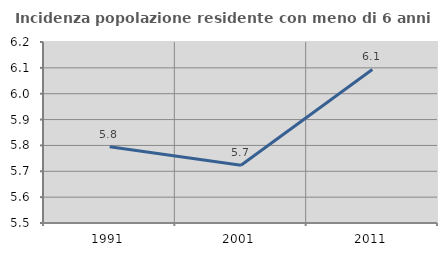
| Category | Incidenza popolazione residente con meno di 6 anni |
|---|---|
| 1991.0 | 5.795 |
| 2001.0 | 5.723 |
| 2011.0 | 6.094 |